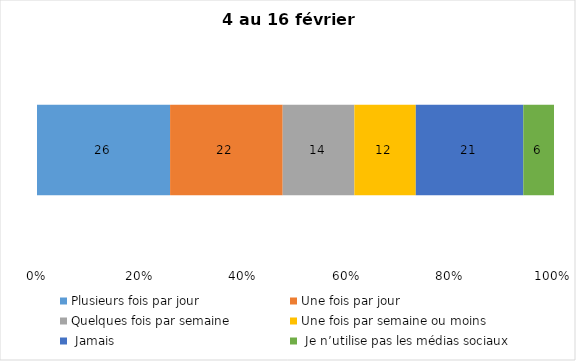
| Category | Plusieurs fois par jour | Une fois par jour | Quelques fois par semaine   | Une fois par semaine ou moins   |  Jamais   |  Je n’utilise pas les médias sociaux |
|---|---|---|---|---|---|---|
| 0 | 26 | 22 | 14 | 12 | 21 | 6 |